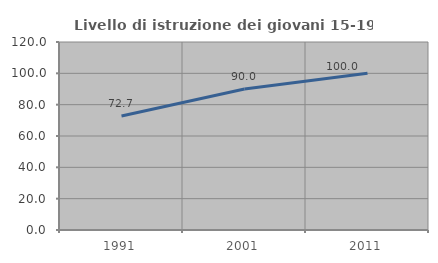
| Category | Livello di istruzione dei giovani 15-19 anni |
|---|---|
| 1991.0 | 72.727 |
| 2001.0 | 90 |
| 2011.0 | 100 |